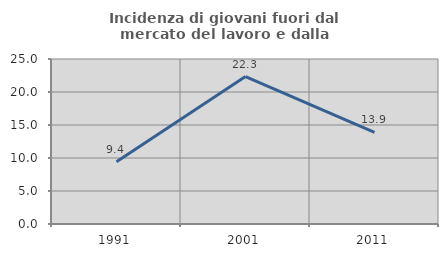
| Category | Incidenza di giovani fuori dal mercato del lavoro e dalla formazione  |
|---|---|
| 1991.0 | 9.429 |
| 2001.0 | 22.337 |
| 2011.0 | 13.898 |